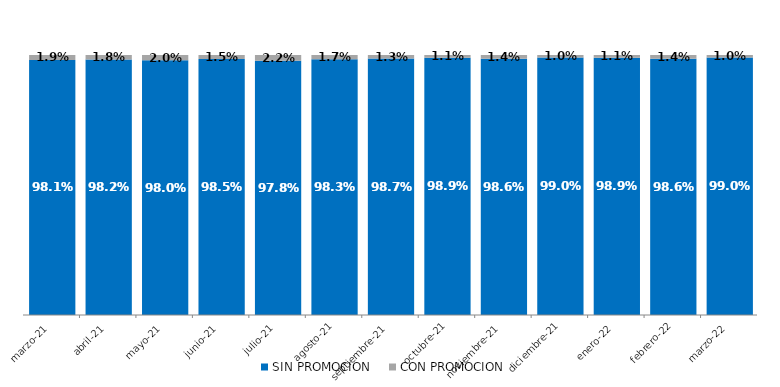
| Category | SIN PROMOCION   | CON PROMOCION   |
|---|---|---|
| 2021-03-01 | 0.981 | 0.019 |
| 2021-04-01 | 0.982 | 0.018 |
| 2021-05-01 | 0.98 | 0.02 |
| 2021-06-01 | 0.985 | 0.015 |
| 2021-07-01 | 0.978 | 0.022 |
| 2021-08-01 | 0.983 | 0.017 |
| 2021-09-01 | 0.987 | 0.013 |
| 2021-10-01 | 0.989 | 0.011 |
| 2021-11-01 | 0.986 | 0.014 |
| 2021-12-01 | 0.99 | 0.01 |
| 2022-01-01 | 0.989 | 0.011 |
| 2022-02-01 | 0.986 | 0.014 |
| 2022-03-01 | 0.99 | 0.01 |